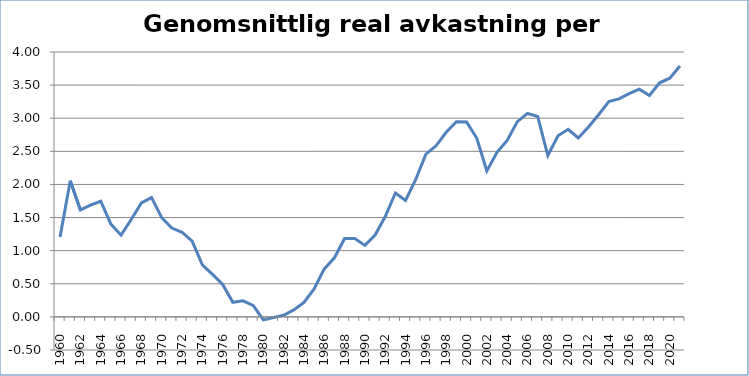
| Category | Genomsnittlig real  |
|---|---|
| 1960.0 | 1.207 |
| 1961.0 | 2.054 |
| 1962.0 | 1.616 |
| 1963.0 | 1.686 |
| 1964.0 | 1.746 |
| 1965.0 | 1.401 |
| 1966.0 | 1.234 |
| 1967.0 | 1.471 |
| 1968.0 | 1.721 |
| 1969.0 | 1.802 |
| 1970.0 | 1.498 |
| 1971.0 | 1.341 |
| 1972.0 | 1.278 |
| 1973.0 | 1.143 |
| 1974.0 | 0.785 |
| 1975.0 | 0.641 |
| 1976.0 | 0.49 |
| 1977.0 | 0.22 |
| 1978.0 | 0.243 |
| 1979.0 | 0.173 |
| 1980.0 | -0.046 |
| 1981.0 | -0.01 |
| 1982.0 | 0.024 |
| 1983.0 | 0.105 |
| 1984.0 | 0.219 |
| 1985.0 | 0.422 |
| 1986.0 | 0.724 |
| 1987.0 | 0.893 |
| 1988.0 | 1.183 |
| 1989.0 | 1.183 |
| 1990.0 | 1.079 |
| 1991.0 | 1.236 |
| 1992.0 | 1.514 |
| 1993.0 | 1.87 |
| 1994.0 | 1.759 |
| 1995.0 | 2.075 |
| 1996.0 | 2.457 |
| 1997.0 | 2.583 |
| 1998.0 | 2.787 |
| 1999.0 | 2.948 |
| 2000.0 | 2.944 |
| 2001.0 | 2.701 |
| 2002.0 | 2.205 |
| 2003.0 | 2.484 |
| 2004.0 | 2.665 |
| 2005.0 | 2.949 |
| 2006.0 | 3.074 |
| 2007.0 | 3.027 |
| 2008.0 | 2.437 |
| 2009.0 | 2.735 |
| 2010.0 | 2.832 |
| 2011.0 | 2.702 |
| 2012.0 | 2.866 |
| 2013.0 | 3.052 |
| 2014.0 | 3.25 |
| 2015.0 | 3.292 |
| 2016.0 | 3.37 |
| 2017.0 | 3.438 |
| 2018.0 | 3.343 |
| 2019.0 | 3.535 |
| 2020.0 | 3.605 |
| 2021.0 | 3.789 |